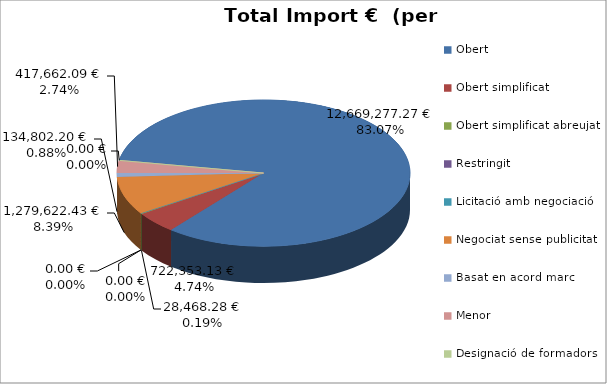
| Category | Total preu              (amb iva) |
|---|---|
| Obert | 12669277.274 |
| Obert simplificat | 722353.133 |
| Obert simplificat abreujat | 28468.275 |
| Restringit | 0 |
| Licitació amb negociació | 0 |
| Negociat sense publicitat | 1279622.426 |
| Basat en acord marc | 134802.204 |
| Menor | 417662.093 |
| Designació de formadors | 0 |